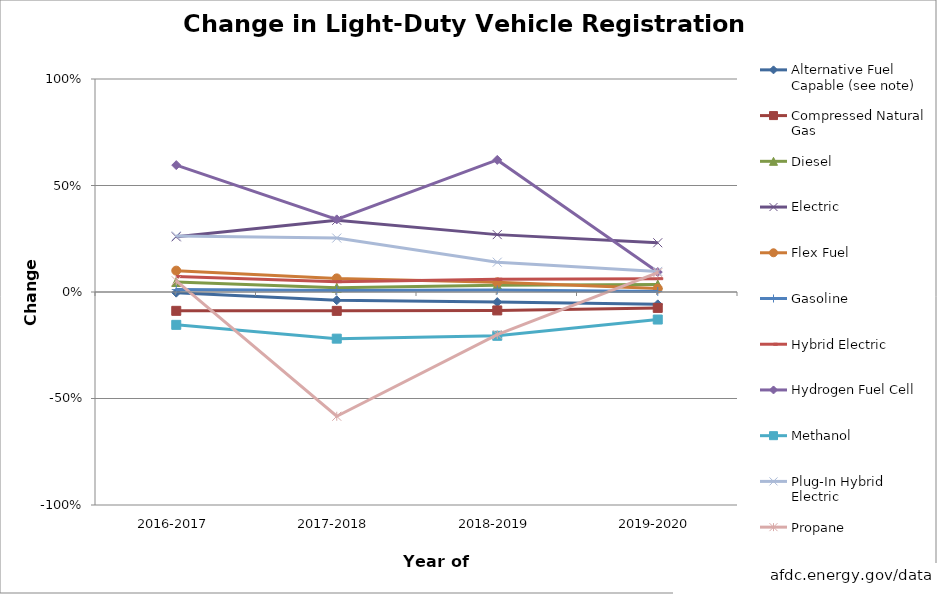
| Category | Alternative Fuel Capable (see note) | Compressed Natural Gas | Diesel | Electric | Flex Fuel | Gasoline | Hybrid Electric | Hydrogen Fuel Cell | Methanol | Plug-In Hybrid Electric | Propane |
|---|---|---|---|---|---|---|---|---|---|---|---|
| 2016-2017 | -0.003 | -0.088 | 0.047 | 0.259 | 0.1 | 0.011 | 0.073 | 0.596 | -0.154 | 0.263 | 0.053 |
| 2017-2018 | -0.039 | -0.089 | 0.02 | 0.337 | 0.064 | 0.007 | 0.049 | 0.341 | -0.219 | 0.253 | -0.583 |
| 2018-2019 | -0.047 | -0.087 | 0.032 | 0.269 | 0.045 | 0.01 | 0.06 | 0.62 | -0.206 | 0.14 | -0.2 |
| 2019-2020 | -0.058 | -0.075 | 0.035 | 0.231 | 0.016 | 0.003 | 0.063 | 0.094 | -0.129 | 0.097 | 0.091 |